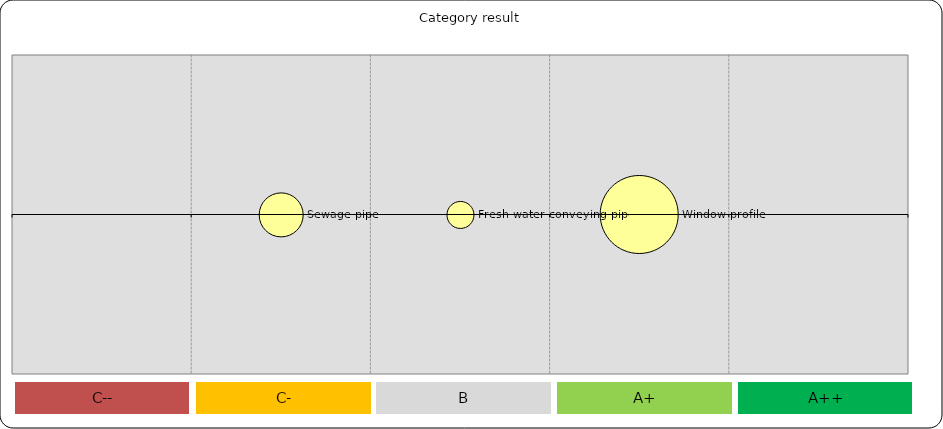
| Category | Category result |
|---|---|
| 16.0 | 0 |
| 0.0 | 0 |
| -16.0 | 0 |
| 0.0 | 0 |
| 0.0 | 0 |
| 0.0 | 0 |
| 0.0 | 0 |
| 0.0 | 0 |
| 0.0 | 0 |
| 0.0 | 0 |